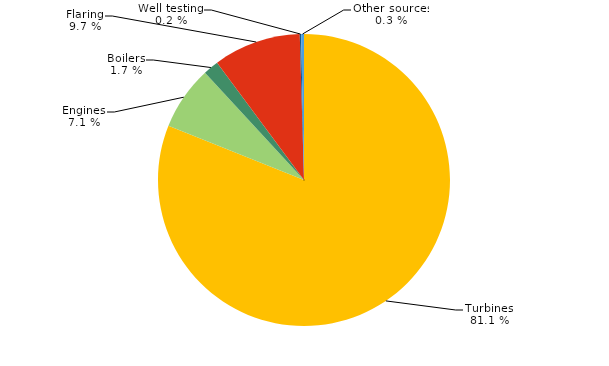
| Category | Series 0 |
|---|---|
| Turbines | 10929.706 |
| Engines | 955.419 |
| Boilers | 230.151 |
| Flaring | 1306.594 |
| Well testing | 20.231 |
| Other sources | 42.228 |